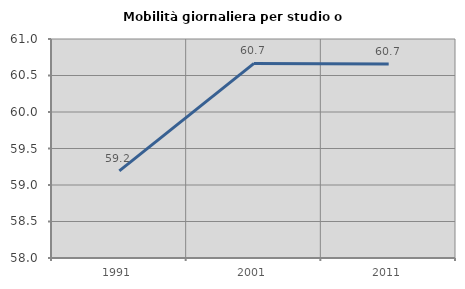
| Category | Mobilità giornaliera per studio o lavoro |
|---|---|
| 1991.0 | 59.194 |
| 2001.0 | 60.665 |
| 2011.0 | 60.657 |